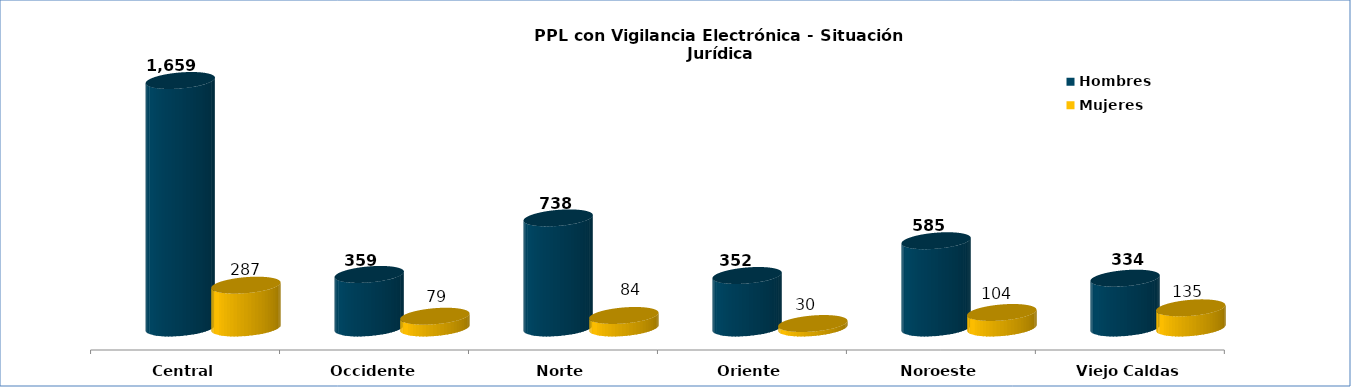
| Category | Hombres | Mujeres |
|---|---|---|
| Central | 1659 | 287 |
| Occidente | 359 | 79 |
| Norte | 738 | 84 |
| Oriente | 352 | 30 |
| Noroeste | 585 | 104 |
| Viejo Caldas | 334 | 135 |